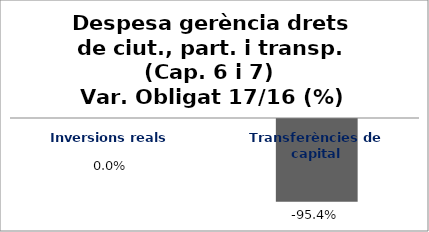
| Category | Series 0 |
|---|---|
| Inversions reals | 0 |
| Transferències de capital | -0.954 |